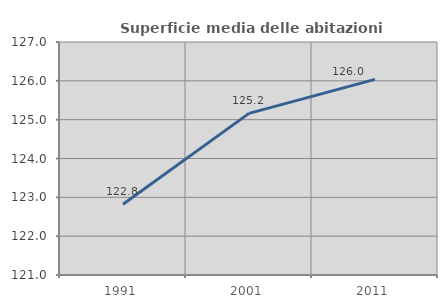
| Category | Superficie media delle abitazioni occupate |
|---|---|
| 1991.0 | 122.824 |
| 2001.0 | 125.162 |
| 2011.0 | 126.037 |